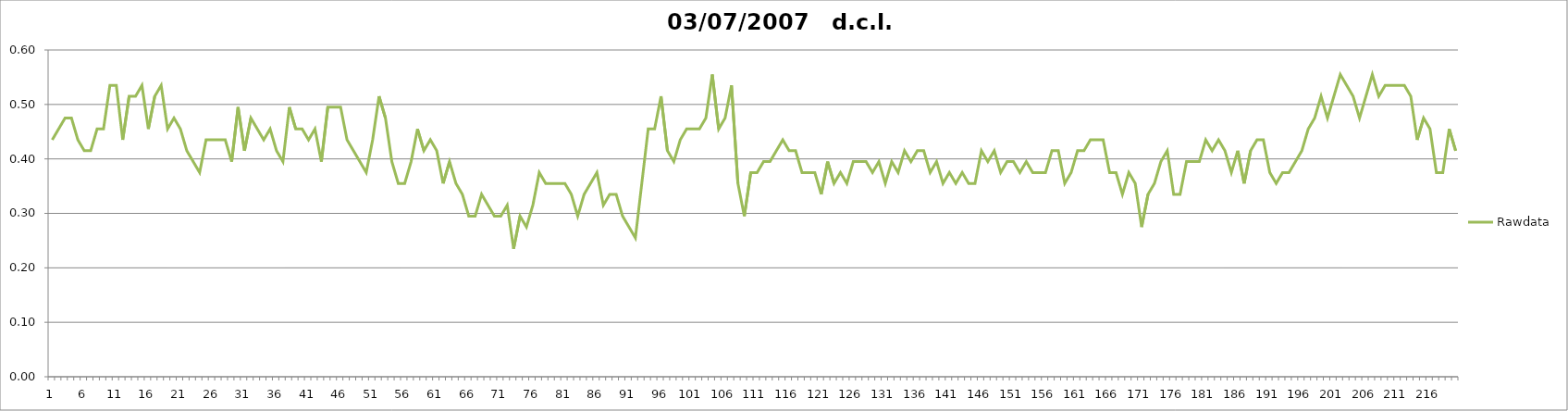
| Category | Rawdata |
|---|---|
| 0 | 0.435 |
| 1 | 0.455 |
| 2 | 0.475 |
| 3 | 0.475 |
| 4 | 0.435 |
| 5 | 0.415 |
| 6 | 0.415 |
| 7 | 0.455 |
| 8 | 0.455 |
| 9 | 0.535 |
| 10 | 0.535 |
| 11 | 0.435 |
| 12 | 0.515 |
| 13 | 0.515 |
| 14 | 0.535 |
| 15 | 0.455 |
| 16 | 0.515 |
| 17 | 0.535 |
| 18 | 0.455 |
| 19 | 0.475 |
| 20 | 0.455 |
| 21 | 0.415 |
| 22 | 0.395 |
| 23 | 0.375 |
| 24 | 0.435 |
| 25 | 0.435 |
| 26 | 0.435 |
| 27 | 0.435 |
| 28 | 0.395 |
| 29 | 0.495 |
| 30 | 0.415 |
| 31 | 0.475 |
| 32 | 0.455 |
| 33 | 0.435 |
| 34 | 0.455 |
| 35 | 0.415 |
| 36 | 0.395 |
| 37 | 0.495 |
| 38 | 0.455 |
| 39 | 0.455 |
| 40 | 0.435 |
| 41 | 0.455 |
| 42 | 0.395 |
| 43 | 0.495 |
| 44 | 0.495 |
| 45 | 0.495 |
| 46 | 0.435 |
| 47 | 0.415 |
| 48 | 0.395 |
| 49 | 0.375 |
| 50 | 0.435 |
| 51 | 0.515 |
| 52 | 0.475 |
| 53 | 0.395 |
| 54 | 0.355 |
| 55 | 0.355 |
| 56 | 0.395 |
| 57 | 0.455 |
| 58 | 0.415 |
| 59 | 0.435 |
| 60 | 0.415 |
| 61 | 0.355 |
| 62 | 0.395 |
| 63 | 0.355 |
| 64 | 0.335 |
| 65 | 0.295 |
| 66 | 0.295 |
| 67 | 0.335 |
| 68 | 0.315 |
| 69 | 0.295 |
| 70 | 0.295 |
| 71 | 0.315 |
| 72 | 0.235 |
| 73 | 0.295 |
| 74 | 0.275 |
| 75 | 0.315 |
| 76 | 0.375 |
| 77 | 0.355 |
| 78 | 0.355 |
| 79 | 0.355 |
| 80 | 0.355 |
| 81 | 0.335 |
| 82 | 0.295 |
| 83 | 0.335 |
| 84 | 0.355 |
| 85 | 0.375 |
| 86 | 0.315 |
| 87 | 0.335 |
| 88 | 0.335 |
| 89 | 0.295 |
| 90 | 0.275 |
| 91 | 0.255 |
| 92 | 0.355 |
| 93 | 0.455 |
| 94 | 0.455 |
| 95 | 0.515 |
| 96 | 0.415 |
| 97 | 0.395 |
| 98 | 0.435 |
| 99 | 0.455 |
| 100 | 0.455 |
| 101 | 0.455 |
| 102 | 0.475 |
| 103 | 0.555 |
| 104 | 0.455 |
| 105 | 0.475 |
| 106 | 0.535 |
| 107 | 0.355 |
| 108 | 0.295 |
| 109 | 0.375 |
| 110 | 0.375 |
| 111 | 0.395 |
| 112 | 0.395 |
| 113 | 0.415 |
| 114 | 0.435 |
| 115 | 0.415 |
| 116 | 0.415 |
| 117 | 0.375 |
| 118 | 0.375 |
| 119 | 0.375 |
| 120 | 0.335 |
| 121 | 0.395 |
| 122 | 0.355 |
| 123 | 0.375 |
| 124 | 0.355 |
| 125 | 0.395 |
| 126 | 0.395 |
| 127 | 0.395 |
| 128 | 0.375 |
| 129 | 0.395 |
| 130 | 0.355 |
| 131 | 0.395 |
| 132 | 0.375 |
| 133 | 0.415 |
| 134 | 0.395 |
| 135 | 0.415 |
| 136 | 0.415 |
| 137 | 0.375 |
| 138 | 0.395 |
| 139 | 0.355 |
| 140 | 0.375 |
| 141 | 0.355 |
| 142 | 0.375 |
| 143 | 0.355 |
| 144 | 0.355 |
| 145 | 0.415 |
| 146 | 0.395 |
| 147 | 0.415 |
| 148 | 0.375 |
| 149 | 0.395 |
| 150 | 0.395 |
| 151 | 0.375 |
| 152 | 0.395 |
| 153 | 0.375 |
| 154 | 0.375 |
| 155 | 0.375 |
| 156 | 0.415 |
| 157 | 0.415 |
| 158 | 0.355 |
| 159 | 0.375 |
| 160 | 0.415 |
| 161 | 0.415 |
| 162 | 0.435 |
| 163 | 0.435 |
| 164 | 0.435 |
| 165 | 0.375 |
| 166 | 0.375 |
| 167 | 0.335 |
| 168 | 0.375 |
| 169 | 0.355 |
| 170 | 0.275 |
| 171 | 0.335 |
| 172 | 0.355 |
| 173 | 0.395 |
| 174 | 0.415 |
| 175 | 0.335 |
| 176 | 0.335 |
| 177 | 0.395 |
| 178 | 0.395 |
| 179 | 0.395 |
| 180 | 0.435 |
| 181 | 0.415 |
| 182 | 0.435 |
| 183 | 0.415 |
| 184 | 0.375 |
| 185 | 0.415 |
| 186 | 0.355 |
| 187 | 0.415 |
| 188 | 0.435 |
| 189 | 0.435 |
| 190 | 0.375 |
| 191 | 0.355 |
| 192 | 0.375 |
| 193 | 0.375 |
| 194 | 0.395 |
| 195 | 0.415 |
| 196 | 0.455 |
| 197 | 0.475 |
| 198 | 0.515 |
| 199 | 0.475 |
| 200 | 0.515 |
| 201 | 0.555 |
| 202 | 0.535 |
| 203 | 0.515 |
| 204 | 0.475 |
| 205 | 0.515 |
| 206 | 0.555 |
| 207 | 0.515 |
| 208 | 0.535 |
| 209 | 0.535 |
| 210 | 0.535 |
| 211 | 0.535 |
| 212 | 0.515 |
| 213 | 0.435 |
| 214 | 0.475 |
| 215 | 0.455 |
| 216 | 0.375 |
| 217 | 0.375 |
| 218 | 0.455 |
| 219 | 0.415 |